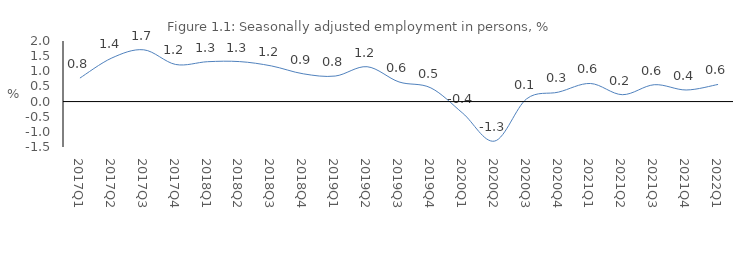
| Category | Series 0 |
|---|---|
| 2017Q1 | 0.777 |
| 2017Q2 | 1.439 |
| 2017Q3 | 1.709 |
| 2017Q4 | 1.225 |
| 2018Q1 | 1.316 |
| 2018Q2 | 1.32 |
| 2018Q3 | 1.178 |
| 2018Q4 | 0.916 |
| 2019Q1 | 0.842 |
| 2019Q2 | 1.151 |
| 2019Q3 | 0.648 |
| 2019Q4 | 0.451 |
| 2020Q1 | -0.386 |
| 2020Q2 | -1.304 |
| 2020Q3 | 0.09 |
| 2020Q4 | 0.313 |
| 2021Q1 | 0.597 |
| 2021Q2 | 0.227 |
| 2021Q3 | 0.557 |
| 2021Q4 | 0.382 |
| 2022Q1 | 0.566 |